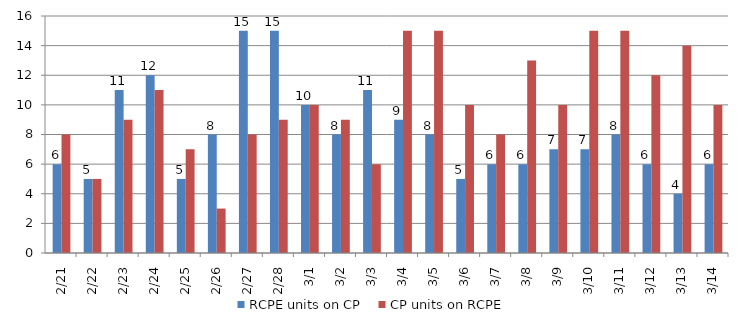
| Category | RCPE units on CP | CP units on RCPE |
|---|---|---|
| 2015-02-21 | 6 | 8 |
| 2015-02-22 | 5 | 5 |
| 2015-02-23 | 11 | 9 |
| 2015-02-24 | 12 | 11 |
| 2015-02-25 | 5 | 7 |
| 2015-02-26 | 8 | 3 |
| 2015-02-27 | 15 | 8 |
| 2015-02-28 | 15 | 9 |
| 2015-03-01 | 10 | 10 |
| 2015-03-02 | 8 | 9 |
| 2015-03-03 | 11 | 6 |
| 2015-03-04 | 9 | 15 |
| 2015-03-05 | 8 | 15 |
| 2015-03-06 | 5 | 10 |
| 2015-03-07 | 6 | 8 |
| 2015-03-08 | 6 | 13 |
| 2015-03-09 | 7 | 10 |
| 2015-03-10 | 7 | 15 |
| 2015-03-11 | 8 | 15 |
| 2015-03-12 | 6 | 12 |
| 2015-03-13 | 4 | 14 |
| 2015-03-14 | 6 | 10 |